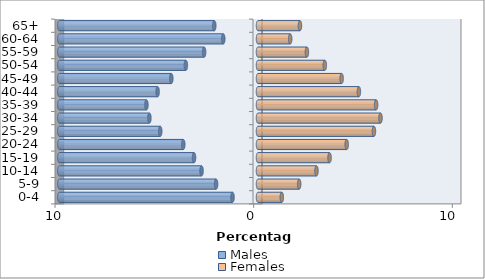
| Category | Males | Females |
|---|---|---|
| 0-4 | -1.283 | 1.199 |
| 5-9 | -2.109 | 2.072 |
| 10-14 | -2.841 | 2.944 |
| 15-19 | -3.22 | 3.601 |
| 20-24 | -3.762 | 4.464 |
| 25-29 | -4.921 | 5.836 |
| 30-34 | -5.467 | 6.166 |
| 35-39 | -5.617 | 5.946 |
| 40-44 | -5.053 | 5.078 |
| 45-49 | -4.364 | 4.209 |
| 50-54 | -3.631 | 3.363 |
| 55-59 | -2.712 | 2.461 |
| 60-64 | -1.748 | 1.62 |
| 65+ | -2.201 | 2.111 |